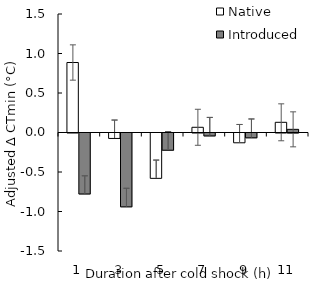
| Category | Native | Introduced |
|---|---|---|
| 1.0 | 0.886 | -0.772 |
| 3.0 | -0.069 | -0.935 |
| 5.0 | -0.574 | -0.218 |
| 7.0 | 0.066 | -0.037 |
| 9.0 | -0.124 | -0.061 |
| 11.0 | 0.129 | 0.04 |